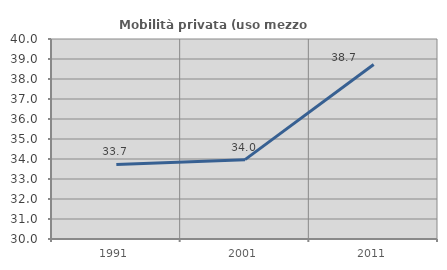
| Category | Mobilità privata (uso mezzo privato) |
|---|---|
| 1991.0 | 33.731 |
| 2001.0 | 33.967 |
| 2011.0 | 38.726 |